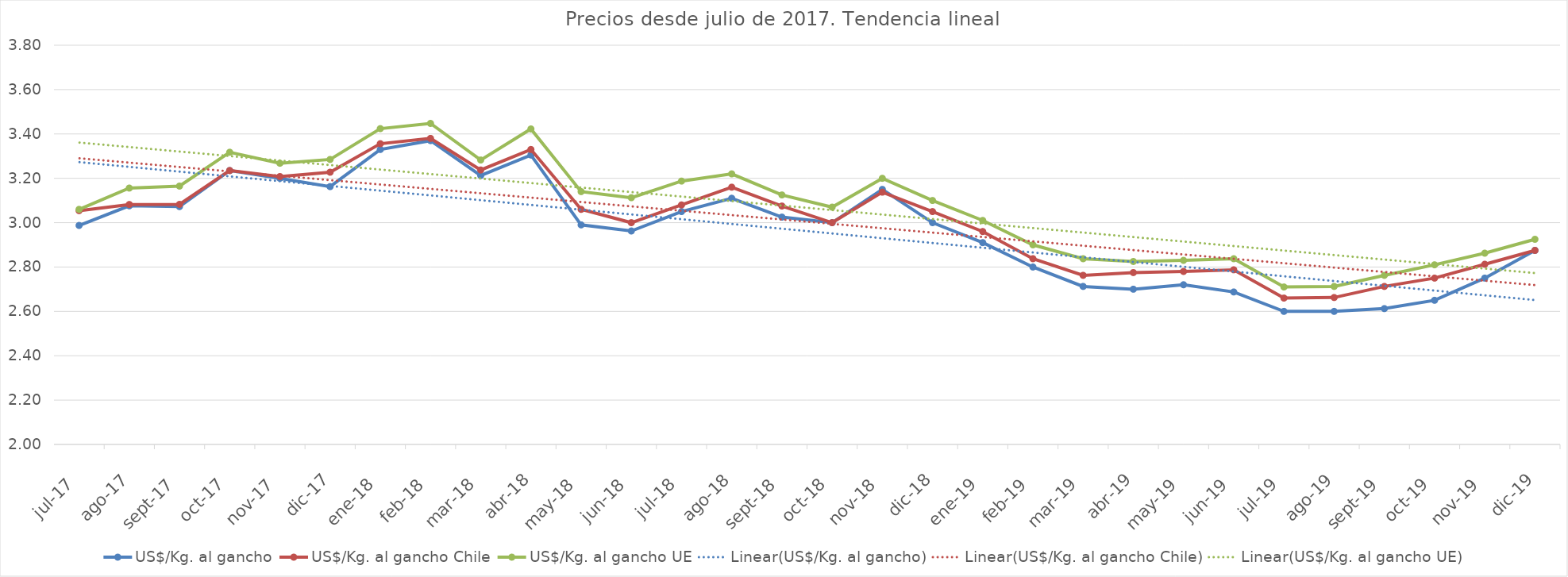
| Category | US$/Kg. al gancho | US$/Kg. al gancho Chile | US$/Kg. al gancho UE |
|---|---|---|---|
| 2017-07-01 | 2.988 | 3.054 | 3.06 |
| 2017-08-01 | 3.076 | 3.082 | 3.156 |
| 2017-09-01 | 3.073 | 3.082 | 3.165 |
| 2017-10-01 | 3.235 | 3.235 | 3.318 |
| 2017-11-01 | 3.2 | 3.208 | 3.268 |
| 2017-12-01 | 3.162 | 3.228 | 3.285 |
| 2018-01-01 | 3.33 | 3.356 | 3.424 |
| 2018-02-01 | 3.37 | 3.38 | 3.448 |
| 2018-03-01 | 3.213 | 3.238 | 3.282 |
| 2018-04-01 | 3.305 | 3.33 | 3.423 |
| 2018-05-01 | 2.99 | 3.06 | 3.14 |
| 2018-06-01 | 2.963 | 3 | 3.112 |
| 2018-07-01 | 3.05 | 3.08 | 3.188 |
| 2018-08-01 | 3.11 | 3.16 | 3.22 |
| 2018-09-01 | 3.025 | 3.075 | 3.125 |
| 2018-10-01 | 3 | 3 | 3.07 |
| 2018-11-01 | 3.15 | 3.137 | 3.2 |
| 2018-12-01 | 3 | 3.05 | 3.1 |
| 2019-01-01 | 2.91 | 2.96 | 3.01 |
| 2019-02-01 | 2.8 | 2.838 | 2.9 |
| 2019-03-01 | 2.713 | 2.762 | 2.838 |
| 2019-04-01 | 2.7 | 2.775 | 2.825 |
| 2019-05-01 | 2.72 | 2.78 | 2.83 |
| 2019-06-01 | 2.688 | 2.787 | 2.838 |
| 2019-07-01 | 2.6 | 2.66 | 2.71 |
| 2019-08-01 | 2.6 | 2.662 | 2.713 |
| 2019-09-01 | 2.612 | 2.713 | 2.762 |
| 2019-10-01 | 2.65 | 2.75 | 2.81 |
| 2019-11-01 | 2.75 | 2.812 | 2.863 |
| 2019-12-01 | 2.875 | 2.875 | 2.925 |